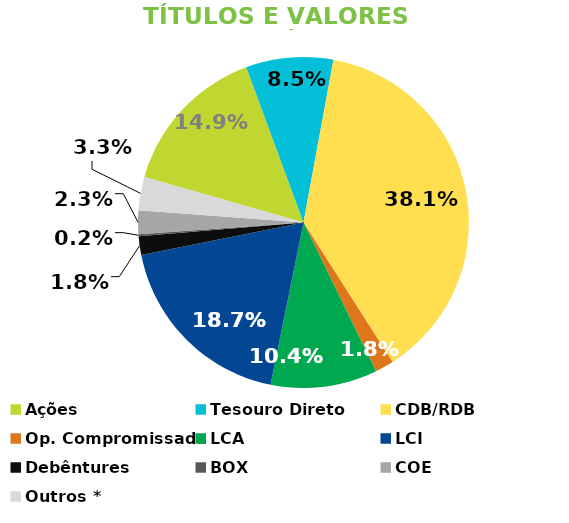
| Category | TVM |
|---|---|
| Ações | 0.149 |
| Tesouro Direto | 0.085 |
| CDB/RDB | 0.381 |
| Op. Compromissada | 0.018 |
| LCA | 0.104 |
| LCI | 0.187 |
| Debêntures | 0.018 |
| BOX | 0.002 |
| COE | 0.023 |
| Outros * | 0.033 |